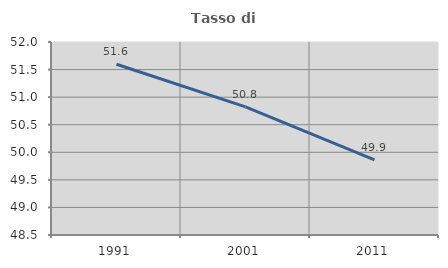
| Category | Tasso di occupazione   |
|---|---|
| 1991.0 | 51.596 |
| 2001.0 | 50.825 |
| 2011.0 | 49.864 |